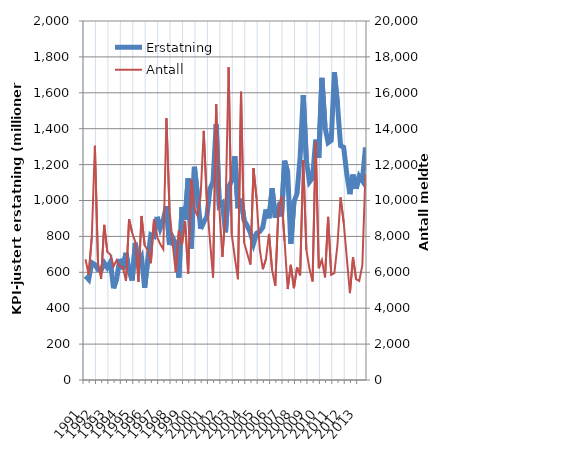
| Category | Erstatning |
|---|---|
| 1991.0 | 579.236 |
| nan | 560.347 |
| nan | 653.814 |
| nan | 642.701 |
| 1992.0 | 614.952 |
| nan | 611.025 |
| nan | 652.408 |
| nan | 626.247 |
| 1993.0 | 657.585 |
| nan | 510.694 |
| nan | 563.454 |
| nan | 674.327 |
| 1994.0 | 617.436 |
| nan | 708.299 |
| nan | 607.065 |
| nan | 554.264 |
| 1995.0 | 763.921 |
| nan | 645.689 |
| nan | 681.297 |
| nan | 513.793 |
| 1996.0 | 669.415 |
| nan | 808.711 |
| nan | 800.646 |
| nan | 908.475 |
| 1997.0 | 844.984 |
| nan | 893.574 |
| nan | 968.756 |
| nan | 753.146 |
| 1998.0 | 793.428 |
| nan | 760.328 |
| nan | 569.839 |
| nan | 963.774 |
| 1999.0 | 892.976 |
| nan | 1124.486 |
| nan | 732.584 |
| nan | 1187.678 |
| 2000.0 | 1029.97 |
| nan | 842.91 |
| nan | 881.241 |
| nan | 909.465 |
| 2001.0 | 1063.079 |
| nan | 1106.589 |
| nan | 1424.857 |
| nan | 971.054 |
| 2002.0 | 986.281 |
| nan | 823.161 |
| nan | 1074.099 |
| nan | 1110.981 |
| 2003.0 | 1246.58 |
| nan | 956.892 |
| nan | 1010.101 |
| nan | 889.576 |
| 2004.0 | 857.951 |
| nan | 820.729 |
| nan | 758.98 |
| nan | 817.677 |
| 2005.0 | 826.537 |
| nan | 850.336 |
| nan | 949.939 |
| nan | 901.449 |
| 2006.0 | 1067.428 |
| nan | 904.085 |
| nan | 958.783 |
| nan | 912.071 |
| 2007.0 | 1221.405 |
| nan | 1157.053 |
| nan | 758.06 |
| nan | 991.7 |
| 2008.0 | 1038.696 |
| nan | 1242.699 |
| nan | 1586.727 |
| nan | 1222.326 |
| 2009.0 | 1103.655 |
| nan | 1126.779 |
| nan | 1339.253 |
| nan | 1237.402 |
| 2010.0 | 1683.084 |
| nan | 1408.498 |
| nan | 1322.431 |
| nan | 1335.187 |
| 2011.0 | 1714.356 |
| nan | 1538.082 |
| nan | 1305.267 |
| nan | 1295.738 |
| 2012.0 | 1147.694 |
| nan | 1035.433 |
| nan | 1144.252 |
| nan | 1066.144 |
| 2013.0 | 1134.371 |
| nan | 1109.226 |
| nan | 1295.777 |